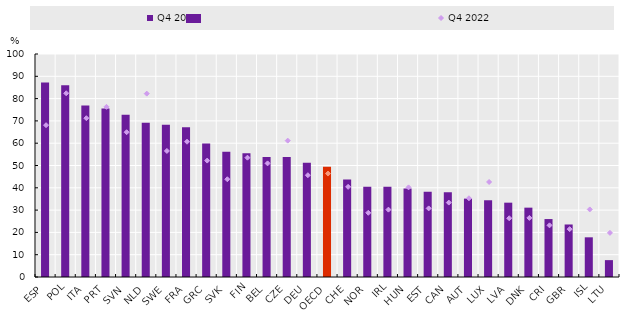
| Category | Q4 2019 |
|---|---|
| ESP | 87.225 |
| POL | 86.021 |
| ITA | 76.884 |
| PRT | 75.603 |
| SVN | 72.753 |
| NLD | 69.201 |
| SWE | 68.259 |
| FRA | 67.128 |
| GRC | 59.822 |
| SVK | 56.206 |
| FIN | 55.498 |
| BEL | 53.803 |
| CZE | 53.779 |
| DEU | 51.216 |
| OECD | 49.39 |
| CHE | 43.736 |
| NOR | 40.523 |
| IRL | 40.426 |
| HUN | 39.701 |
| EST | 38.248 |
| CAN | 38.007 |
| AUT | 35.152 |
| LUX | 34.414 |
| LVA | 33.331 |
| DNK | 31.097 |
| CRI | 25.98 |
| GBR | 23.551 |
| ISL | 17.796 |
| LTU | 7.566 |